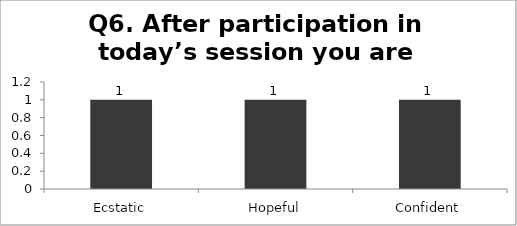
| Category | Q6. After participation in today’s session you are feeling? |
|---|---|
| Ecstatic | 1 |
| Hopeful | 1 |
| Confident | 1 |